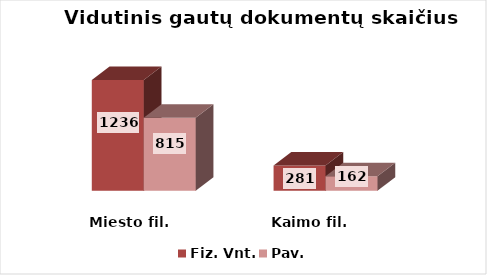
| Category | Fiz. Vnt. | Pav. |
|---|---|---|
| Miesto fil. | 1236 | 815 |
| Kaimo fil. | 281 | 162 |